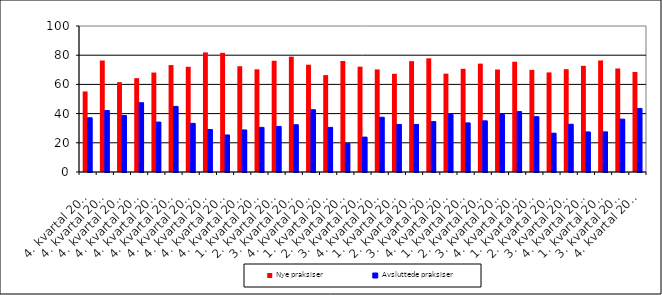
| Category | Nye praksiser | Avsluttede |
|---|---|---|
| 4. kvartal 2001 | 55.172 | 37.143 |
| 4. kvartal 2002 | 76.364 | 42.105 |
| 4. kvartal 2003 | 61.538 | 38.71 |
| 4. kvartal 2004 | 64.286 | 47.458 |
| 4. kvartal 2005 | 68.116 | 34.211 |
| 4. kvartal 2010 | 73.239 | 44.928 |
| 4. kvartal 2011 | 72.059 | 33.333 |
| 4. kvartal 2012 | 81.915 | 29.114 |
| 4. kvartal 2013 | 81.609 | 25.373 |
| 4. kvartal 2014 | 72.414 | 28.814 |
| 1. kvartal 2015 | 70.33 | 30.556 |
| 2. kvartal 2015 | 76.19 | 31.25 |
| 3. kvartal 2015 | 79 | 32.381 |
| 4. kvartal 2015 | 73.494 | 42.667 |
| 1. kvartal 2016 | 66.346 | 30.556 |
| 2. kvartal 2016 | 76.042 | 19.672 |
| 3. kvartal 2016 | 72.131 | 23.913 |
| 4. kvartal 2016 | 70.238 | 37.5 |
| 1. kvartal 2017 | 67.273 | 32.584 |
| 2. kvartal 2017 | 75.926 | 32.609 |
| 3. kvartal 2017 | 77.869 | 34.524 |
| 4. kvartal 2017 | 67.368 | 39.474 |
| 1. kvartal 2018 | 70.677 | 33.628 |
| 2. kvartal 2018 | 74.227 | 35.052 |
| 3. kvartal 2018 | 70.186 | 39.394 |
| 4. kvartal 2018 | 75.532 | 41.379 |
| 1. kvartal 2019 | 69.912 | 37.895 |
| 2. kvartal 2019 | 68.224 | 26.596 |
| 3. kvartal 2019 | 70.423 | 32.716 |
| 4. kvartal 2019 | 72.727 | 27.434 |
| 1. kvartal 2020 | 76.389 | 27.481 |
| 3. kvartal 2020 | 70.896 | 36.196 |
| 4. kvartal 2020 | 68.539 | 43.548 |